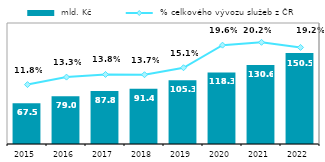
| Category |  mld. Kč |
|---|---|
| 2015.0 | 67.463 |
| 2016.0 | 79.004 |
| 2017.0 | 87.808 |
| 2018.0 | 91.441 |
| 2019.0 | 105.286 |
| 2020.0 | 118.327 |
| 2021.0 | 130.626 |
| 2022.0 | 150.482 |